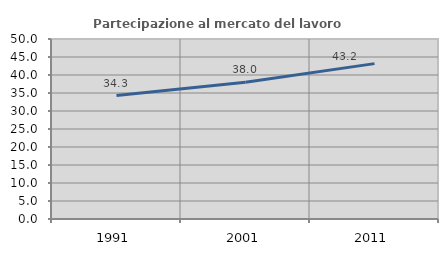
| Category | Partecipazione al mercato del lavoro  femminile |
|---|---|
| 1991.0 | 34.297 |
| 2001.0 | 37.982 |
| 2011.0 | 43.163 |